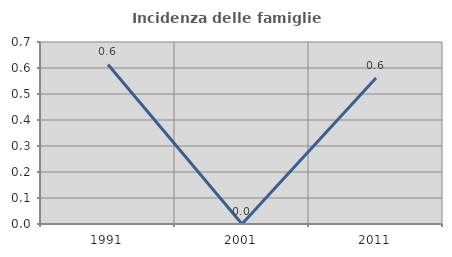
| Category | Incidenza delle famiglie numerose |
|---|---|
| 1991.0 | 0.613 |
| 2001.0 | 0 |
| 2011.0 | 0.562 |